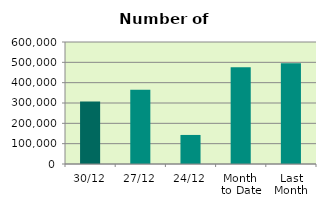
| Category | Series 0 |
|---|---|
| 30/12 | 307918 |
| 27/12 | 365126 |
| 24/12 | 142880 |
| Month 
to Date | 475862.737 |
| Last
Month | 495852.095 |